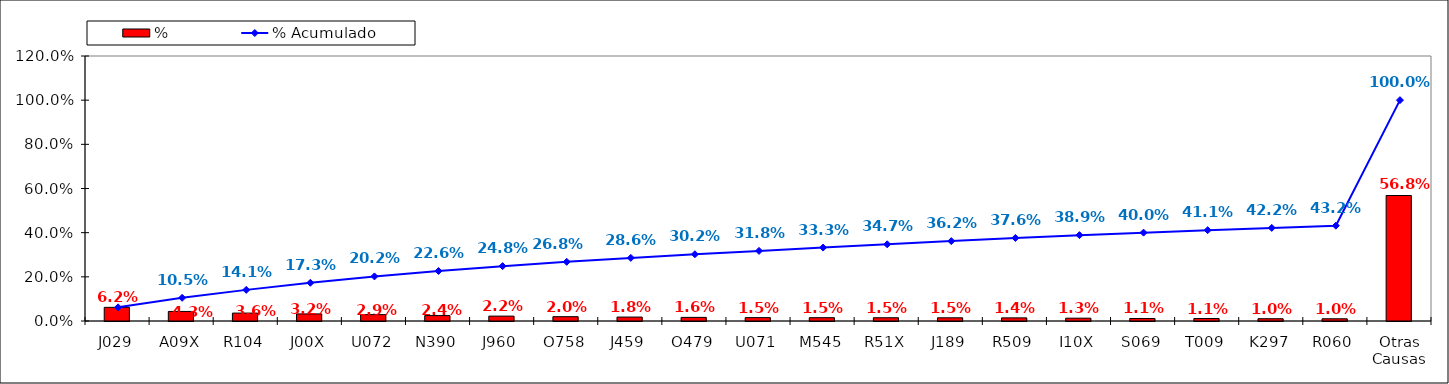
| Category | % |
|---|---|
| J029 | 0.062 |
| A09X | 0.043 |
| R104 | 0.036 |
| J00X | 0.032 |
| U072 | 0.029 |
| N390 | 0.024 |
| J960 | 0.022 |
| O758 | 0.02 |
| J459 | 0.018 |
| O479 | 0.016 |
| U071 | 0.015 |
| M545 | 0.015 |
| R51X | 0.015 |
| J189 | 0.015 |
| R509 | 0.014 |
| I10X | 0.013 |
| S069 | 0.011 |
| T009 | 0.011 |
| K297 | 0.01 |
| R060 | 0.01 |
| Otras Causas | 0.568 |